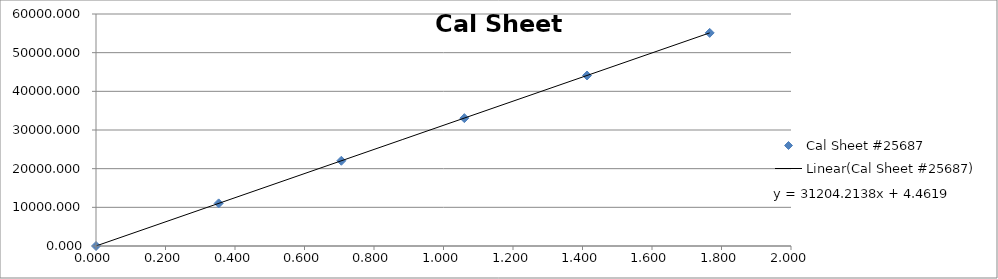
| Category | Cal Sheet #25687 |
|---|---|
| 0.0 | 0 |
| 0.353 | 11023.113 |
| 0.706 | 22046.226 |
| 1.06 | 33069.339 |
| 1.413 | 44092.452 |
| 1.766 | 55115.566 |